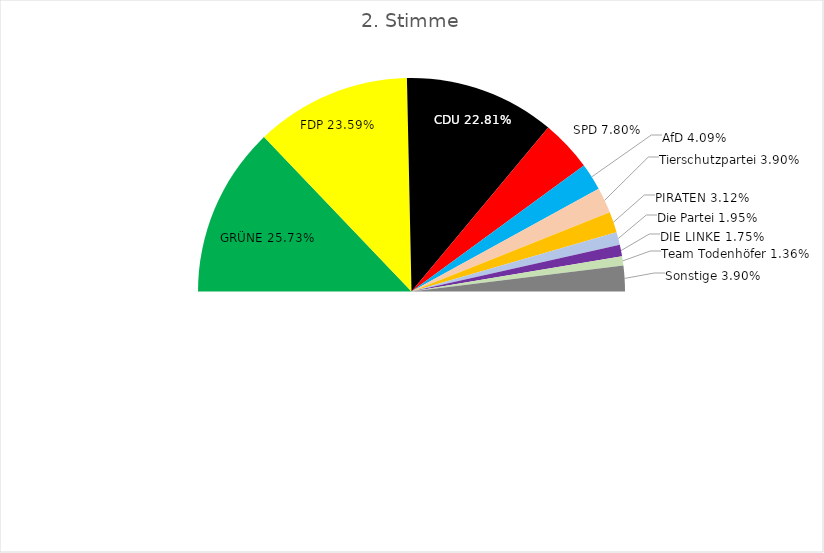
| Category | Prozent |
|---|---|
| GRÜNE | 0.257 |
| FDP | 0.236 |
| CDU | 0.228 |
| SPD | 0.078 |
| AfD | 0.041 |
| Tierschutzpartei | 0.039 |
| PIRATEN | 0.031 |
| Die Partei | 0.019 |
| DIE LINKE | 0.018 |
| Team Todenhöfer | 0.014 |
| Sonstige | 0.039 |
| 2. Hälfte | 1 |